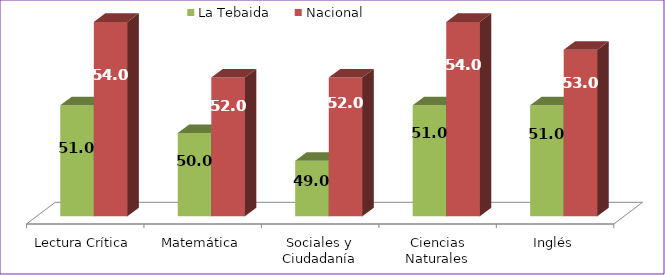
| Category | La Tebaida | Nacional |
|---|---|---|
| Lectura Crítica | 51 | 54 |
| Matemática | 50 | 52 |
| Sociales y Ciudadanía | 49 | 52 |
| Ciencias Naturales | 51 | 54 |
| Inglés | 51 | 53 |